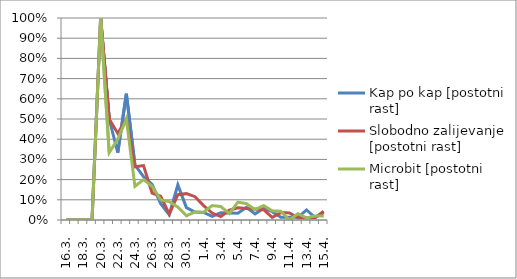
| Category | Kap po kap [postotni rast] | Slobodno zalijevanje [postotni rast] | Microbit [postotni rast] |
|---|---|---|---|
| 16.3. | 0 | 0 | 0 |
| 17.3. | 0 | 0 | 0 |
| 18.3. | 0 | 0 | 0 |
| 19.3. | 0 | 0 | 0 |
| 20.3. | 1 | 1 | 1 |
| 21.3. | 0.5 | 0.5 | 0.333 |
| 22.3. | 0.333 | 0.429 | 0.4 |
| 23.3. | 0.625 | 0.5 | 0.5 |
| 24.3. | 0.273 | 0.263 | 0.167 |
| 25.3. | 0.214 | 0.269 | 0.2 |
| 26.3. | 0.176 | 0.133 | 0.167 |
| 27.3. | 0.081 | 0.118 | 0.1 |
| 28.3. | 0.026 | 0.029 | 0.091 |
| 29.3. | 0.174 | 0.125 | 0.064 |
| 30.3. | 0.061 | 0.13 | 0.021 |
| 31.3. | 0.039 | 0.115 | 0.04 |
| 1.4. | 0.038 | 0.071 | 0.038 |
| 2.4. | 0.019 | 0.034 | 0.071 |
| 3.4. | 0.036 | 0.017 | 0.067 |
| 4.4. | 0.034 | 0.048 | 0.032 |
| 5.4. | 0.033 | 0.061 | 0.088 |
| 6.4. | 0.062 | 0.057 | 0.081 |
| 7.4. | 0.03 | 0.054 | 0.051 |
| 8.4. | 0.057 | 0.051 | 0.071 |
| 9.4. | 0.041 | 0.013 | 0.045 |
| 10.4. | 0.014 | 0.037 | 0.043 |
| 11.4. | 0.013 | 0.035 | 0 |
| 12.4. | 0.013 | 0.012 | 0.032 |
| 13.4. | 0.05 | 0.011 | 0.01 |
| 14.4. | 0.012 | 0.011 | 0.02 |
| 15.4. | 0.036 | 0.043 | 0.02 |